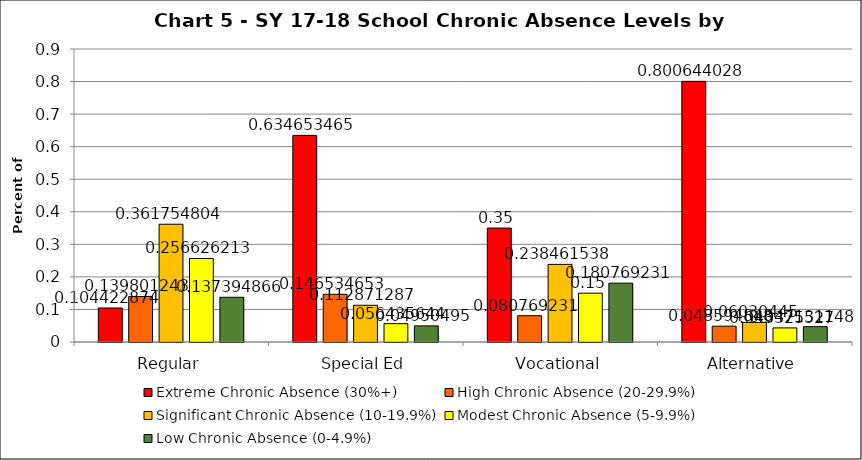
| Category | Extreme Chronic Absence (30%+) | High Chronic Absence (20-29.9%) | Significant Chronic Absence (10-19.9%) | Modest Chronic Absence (5-9.9%) | Low Chronic Absence (0-4.9%) |
|---|---|---|---|---|---|
| 0 | 0.104 | 0.14 | 0.362 | 0.257 | 0.137 |
| 1 | 0.635 | 0.147 | 0.113 | 0.056 | 0.05 |
| 2 | 0.35 | 0.081 | 0.238 | 0.15 | 0.181 |
| 3 | 0.801 | 0.049 | 0.06 | 0.043 | 0.047 |